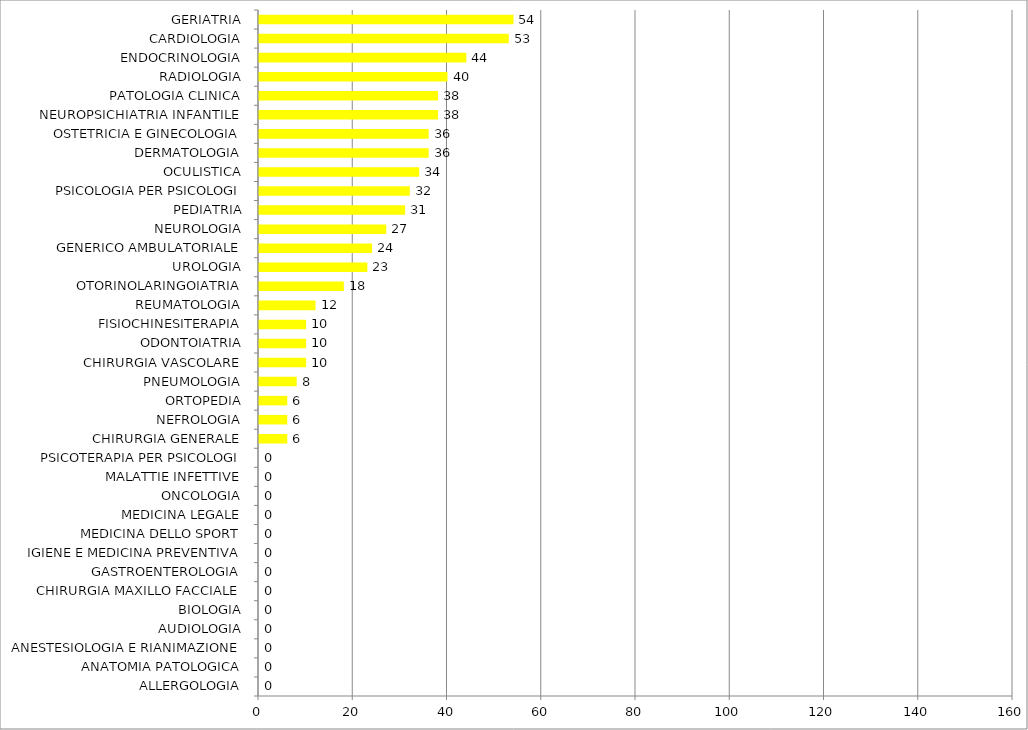
| Category | Series 0 |
|---|---|
| ALLERGOLOGIA | 0 |
| ANATOMIA PATOLOGICA | 0 |
| ANESTESIOLOGIA E RIANIMAZIONE | 0 |
| AUDIOLOGIA | 0 |
| BIOLOGIA | 0 |
| CHIRURGIA MAXILLO FACCIALE | 0 |
| GASTROENTEROLOGIA | 0 |
| IGIENE E MEDICINA PREVENTIVA | 0 |
| MEDICINA DELLO SPORT | 0 |
| MEDICINA LEGALE | 0 |
| ONCOLOGIA | 0 |
| MALATTIE INFETTIVE | 0 |
| PSICOTERAPIA PER PSICOLOGI | 0 |
| CHIRURGIA GENERALE | 6 |
| NEFROLOGIA | 6 |
| ORTOPEDIA | 6 |
| PNEUMOLOGIA | 8 |
| CHIRURGIA VASCOLARE | 10 |
| ODONTOIATRIA | 10 |
| FISIOCHINESITERAPIA | 10 |
| REUMATOLOGIA | 12 |
| OTORINOLARINGOIATRIA | 18 |
| UROLOGIA | 23 |
| GENERICO AMBULATORIALE | 24 |
| NEUROLOGIA | 27 |
| PEDIATRIA | 31 |
| PSICOLOGIA PER PSICOLOGI | 32 |
| OCULISTICA | 34 |
| DERMATOLOGIA | 36 |
| OSTETRICIA E GINECOLOGIA | 36 |
| NEUROPSICHIATRIA INFANTILE | 38 |
| PATOLOGIA CLINICA | 38 |
| RADIOLOGIA | 40 |
| ENDOCRINOLOGIA | 44 |
| CARDIOLOGIA | 53 |
| GERIATRIA | 54 |